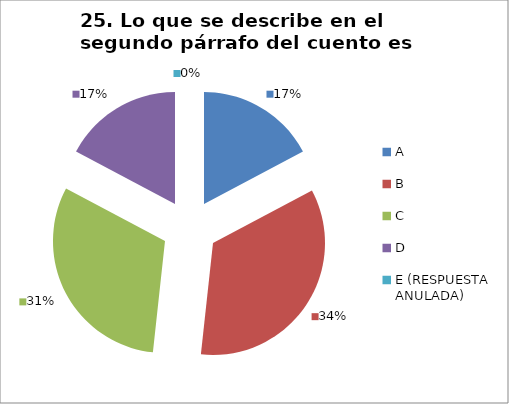
| Category | CANTIDAD DE RESPUESTAS PREGUNTA (23) | PORCENTAJE |
|---|---|---|
| A | 5 | 0.172 |
| B | 10 | 0.345 |
| C | 9 | 0.31 |
| D | 5 | 0.172 |
| E (RESPUESTA ANULADA) | 0 | 0 |